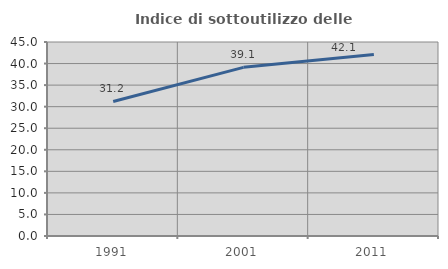
| Category | Indice di sottoutilizzo delle abitazioni  |
|---|---|
| 1991.0 | 31.21 |
| 2001.0 | 39.117 |
| 2011.0 | 42.121 |